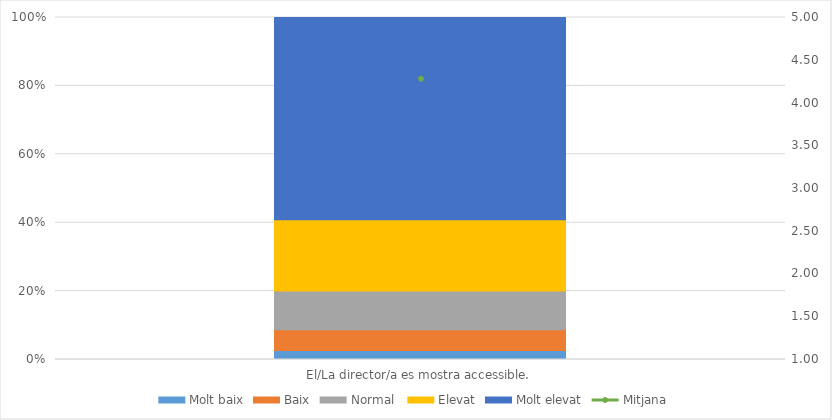
| Category | Molt baix | Baix | Normal  | Elevat | Molt elevat |
|---|---|---|---|---|---|
| El/La director/a es mostra accessible. | 3 | 7 | 13 | 24 | 68 |